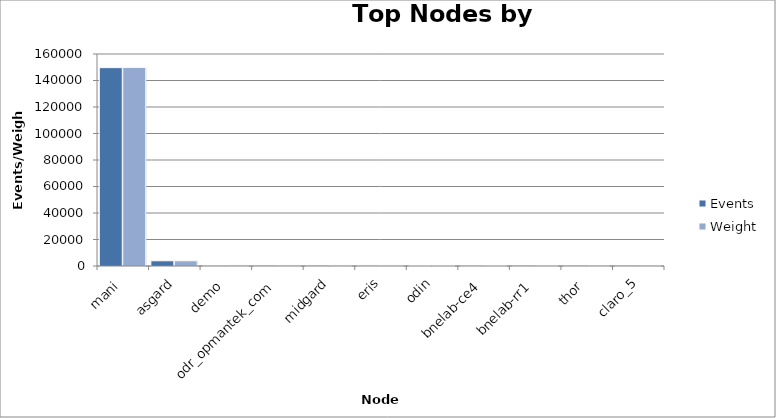
| Category | Events | Weight |
|---|---|---|
| mani | 149688 | 149830 |
| asgard | 3927 | 3933 |
| demo | 135 | 613 |
| odr_opmantek_com | 570 | 570 |
| midgard | 560 | 560 |
| eris | 528 | 532 |
| odin | 348 | 351 |
| bnelab-ce4 | 88 | 315 |
| bnelab-rr1 | 79 | 243 |
| thor | 55 | 198 |
| claro_5 | 67 | 167 |